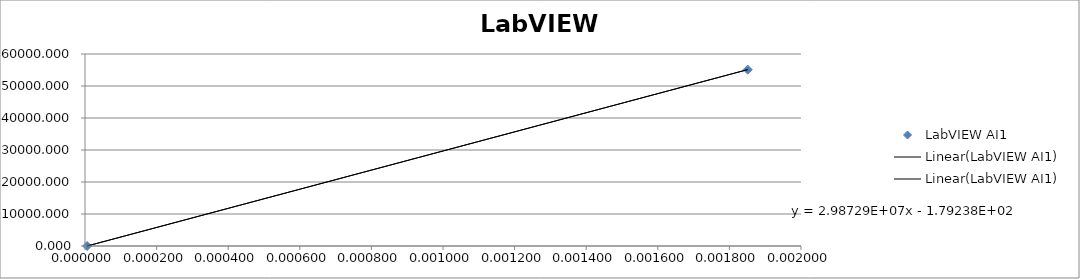
| Category | LabVIEW AI1 |
|---|---|
| 6e-06 | 0 |
| nan | 11023.113 |
| nan | 22046.226 |
| nan | 33069.339 |
| nan | 44092.452 |
| 0.001851 | 55115.566 |